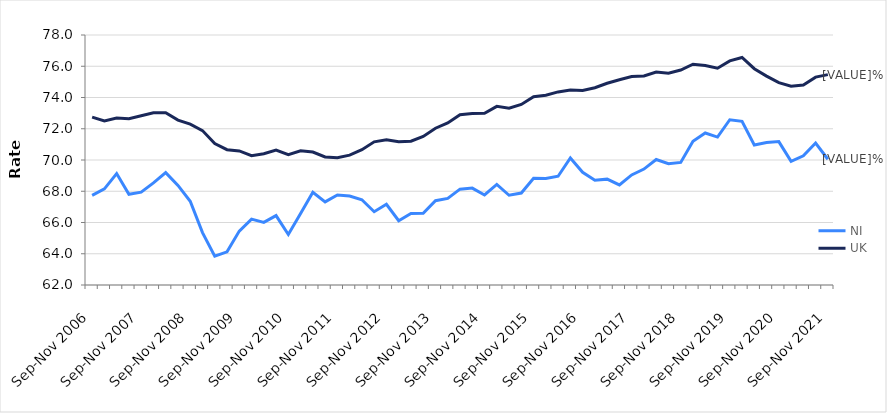
| Category | NI | UK |
|---|---|---|
| Sep-Nov 2006 | 67.737 | 72.745 |
| Dec-Feb 2007 | 68.154 | 72.499 |
| Mar-May 2007 | 69.129 | 72.691 |
| Jun-Aug 2007 | 67.802 | 72.644 |
| Sep-Nov 2007 | 67.944 | 72.83 |
| Dec-Feb 2008 | 68.532 | 73.021 |
| Mar-May 2008 | 69.193 | 73.027 |
| Jun-Aug 2008 | 68.372 | 72.555 |
| Sep-Nov 2008 | 67.357 | 72.291 |
| Dec-Feb 2009 | 65.352 | 71.882 |
| Mar-May 2009 | 63.847 | 71.049 |
| Jun-Aug 2009 | 64.122 | 70.661 |
| Sep-Nov 2009 | 65.451 | 70.579 |
| Dec-Feb 2010 | 66.217 | 70.28 |
| Mar-May 2010 | 66.009 | 70.398 |
| Jun-Aug 2010 | 66.442 | 70.639 |
| Sep-Nov 2010 | 65.232 | 70.339 |
| Dec-Feb 2011 | 66.574 | 70.586 |
| Mar-May 2011 | 67.937 | 70.512 |
| Jun-Aug 2011 | 67.32 | 70.195 |
| Sep-Nov 2011 | 67.762 | 70.145 |
| Dec-Feb 2012 | 67.69 | 70.313 |
| Mar-May 2012 | 67.458 | 70.66 |
| Jun-Aug 2012 | 66.691 | 71.164 |
| Sep-Nov 2012 | 67.167 | 71.29 |
| Dec-Feb 2013 | 66.112 | 71.163 |
| Mar-May 2013 | 66.574 | 71.205 |
| Jun-Aug 2013 | 66.587 | 71.509 |
| Sep-Nov 2013 | 67.397 | 72.034 |
| Dec-Feb 2014 | 67.54 | 72.373 |
| Mar-May 2014 | 68.133 | 72.903 |
| Jun-Aug 2014 | 68.203 | 72.974 |
| Sep-Nov 2014 | 67.762 | 72.993 |
| Dec-Feb 2015 | 68.44 | 73.433 |
| Mar-May 2015 | 67.744 | 73.309 |
| Jun-Aug 2015 | 67.887 | 73.559 |
| Sep-Nov 2015 | 68.833 | 74.049 |
| Dec-Feb 2016 | 68.816 | 74.14 |
| Mar-May 2016 | 68.959 | 74.357 |
| Jun-Aug 2016 | 70.127 | 74.486 |
| Sep-Nov 2016 | 69.214 | 74.447 |
| Dec-Feb 2017 | 68.706 | 74.624 |
| Mar-May 2017 | 68.774 | 74.909 |
| Jun-Aug 2017 | 68.402 | 75.138 |
| Sep-Nov 2017 | 69.045 | 75.338 |
| Dec-Feb 2018 | 69.419 | 75.375 |
| Mar-May 2018 | 70.029 | 75.632 |
| Jun-Aug 2018 | 69.765 | 75.557 |
| Sep-Nov 2018 | 69.845 | 75.761 |
| Dec-Feb 2019 | 71.196 | 76.127 |
| Mar-May 2019 | 71.727 | 76.049 |
| Jun-Aug 2019 | 71.467 | 75.874 |
| Sep-Nov 2019 | 72.576 | 76.343 |
| Dec-Feb 2020 | 72.473 | 76.562 |
| Mar-May 2020 | 70.959 | 75.842 |
| Jun-Aug 2020 | 71.117 | 75.37 |
| Sep-Nov 2020 | 71.178 | 74.949 |
| Dec-Feb 2021 | 69.913 | 74.721 |
| Mar-May 2021 | 70.264 | 74.805 |
| Jun-Aug 2021 | 71.083 | 75.304 |
| Sep-Nov 2021 | 70.047 | 75.464 |